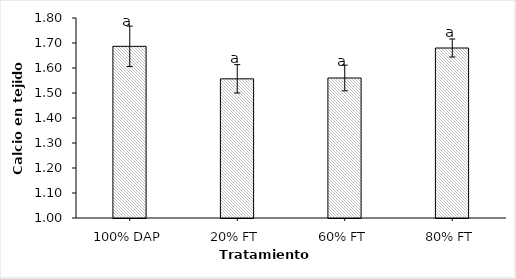
| Category | Ca |
|---|---|
| 100% DAP | 1.687 |
| 20% FT | 1.557 |
| 60% FT | 1.56 |
| 80% FT | 1.68 |